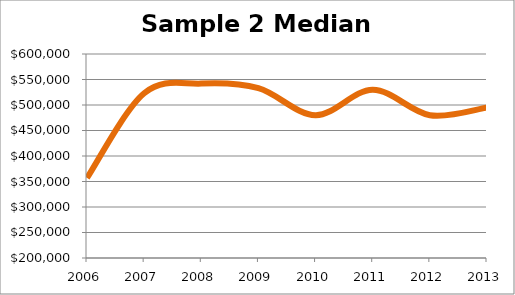
| Category | Median Price |
|---|---|
| 2006.0 | 357000 |
| 2007.0 | 523000 |
| 2008.0 | 542000 |
| 2009.0 | 533000 |
| 2010.0 | 480000 |
| 2011.0 | 530000 |
| 2012.0 | 480000 |
| 2013.0 | 495000 |